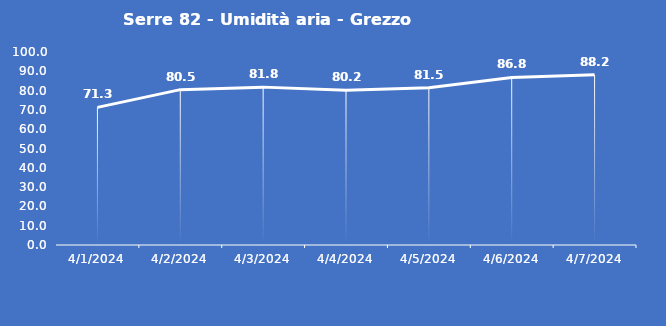
| Category | Serre 82 - Umidità aria - Grezzo (%) |
|---|---|
| 4/1/24 | 71.3 |
| 4/2/24 | 80.5 |
| 4/3/24 | 81.8 |
| 4/4/24 | 80.2 |
| 4/5/24 | 81.5 |
| 4/6/24 | 86.8 |
| 4/7/24 | 88.2 |